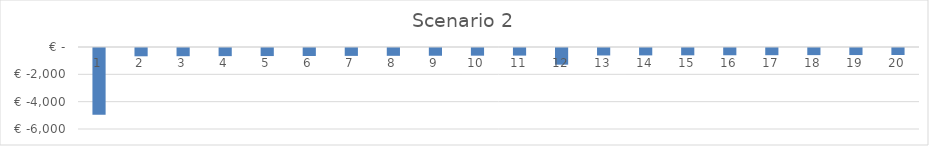
| Category | Series 0 |
|---|---|
| 0 | -4878.25 |
| 1 | -606.226 |
| 2 | -600.507 |
| 3 | -594.842 |
| 4 | -589.23 |
| 5 | -583.672 |
| 6 | -578.165 |
| 7 | -572.711 |
| 8 | -567.308 |
| 9 | -561.956 |
| 10 | -556.655 |
| 11 | -1220.476 |
| 12 | -546.201 |
| 13 | -541.048 |
| 14 | -535.944 |
| 15 | -530.888 |
| 16 | -525.88 |
| 17 | -520.919 |
| 18 | -516.004 |
| 19 | -511.136 |